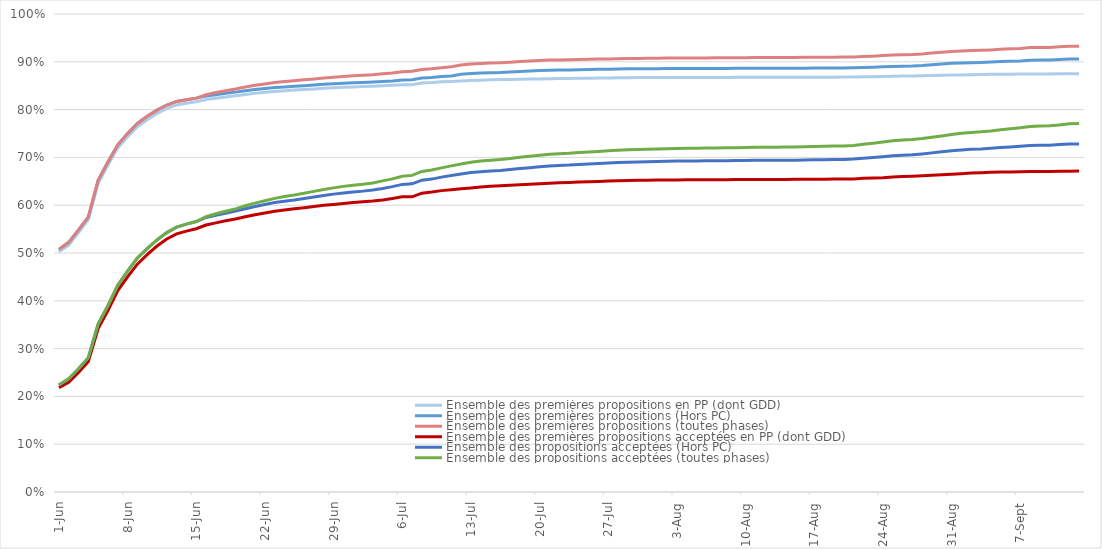
| Category | Ensemble des premières propositions en PP (dont GDD) | Ensemble des premières propositions (Hors PC) | Ensemble des premières propositions (toutes phases) | Ensemble des premières propositions acceptées en PP (dont GDD) | Ensemble des propositions acceptées (Hors PC) | Ensemble des propositions acceptées (toutes phases) |
|---|---|---|---|---|---|---|
| 2023-06-01 | 0.503 | 0.508 | 0.508 | 0.219 | 0.224 | 0.224 |
| 2023-06-02 | 0.516 | 0.522 | 0.522 | 0.229 | 0.237 | 0.237 |
| 2023-06-03 | 0.543 | 0.548 | 0.548 | 0.25 | 0.258 | 0.258 |
| 2023-06-04 | 0.57 | 0.576 | 0.576 | 0.273 | 0.281 | 0.281 |
| 2023-06-05 | 0.646 | 0.652 | 0.652 | 0.342 | 0.351 | 0.351 |
| 2023-06-06 | 0.684 | 0.69 | 0.69 | 0.379 | 0.39 | 0.39 |
| 2023-06-07 | 0.719 | 0.726 | 0.726 | 0.421 | 0.433 | 0.433 |
| 2023-06-08 | 0.743 | 0.75 | 0.75 | 0.45 | 0.462 | 0.462 |
| 2023-06-09 | 0.764 | 0.771 | 0.771 | 0.477 | 0.489 | 0.489 |
| 2023-06-10 | 0.779 | 0.786 | 0.786 | 0.497 | 0.509 | 0.509 |
| 2023-06-11 | 0.792 | 0.799 | 0.799 | 0.515 | 0.527 | 0.527 |
| 2023-06-12 | 0.802 | 0.81 | 0.81 | 0.529 | 0.543 | 0.543 |
| 2023-06-13 | 0.81 | 0.817 | 0.817 | 0.54 | 0.554 | 0.554 |
| 2023-06-14 | 0.813 | 0.821 | 0.821 | 0.546 | 0.56 | 0.56 |
| 2023-06-15 | 0.817 | 0.824 | 0.824 | 0.551 | 0.566 | 0.566 |
| 2023-06-16 | 0.821 | 0.829 | 0.831 | 0.559 | 0.574 | 0.576 |
| 2023-06-17 | 0.824 | 0.831 | 0.836 | 0.563 | 0.579 | 0.582 |
| 2023-06-18 | 0.826 | 0.834 | 0.84 | 0.567 | 0.583 | 0.587 |
| 2023-06-19 | 0.829 | 0.837 | 0.843 | 0.571 | 0.588 | 0.592 |
| 2023-06-20 | 0.832 | 0.839 | 0.847 | 0.576 | 0.593 | 0.599 |
| 2023-06-21 | 0.834 | 0.842 | 0.851 | 0.58 | 0.597 | 0.604 |
| 2023-06-22 | 0.836 | 0.844 | 0.854 | 0.584 | 0.602 | 0.609 |
| 2023-06-23 | 0.838 | 0.846 | 0.857 | 0.587 | 0.605 | 0.614 |
| 2023-06-24 | 0.839 | 0.847 | 0.859 | 0.59 | 0.608 | 0.618 |
| 2023-06-25 | 0.841 | 0.849 | 0.861 | 0.593 | 0.611 | 0.621 |
| 2023-06-26 | 0.842 | 0.85 | 0.862 | 0.595 | 0.614 | 0.625 |
| 2023-06-27 | 0.843 | 0.852 | 0.864 | 0.597 | 0.617 | 0.629 |
| 2023-06-28 | 0.845 | 0.853 | 0.866 | 0.6 | 0.62 | 0.633 |
| 2023-06-29 | 0.846 | 0.854 | 0.868 | 0.602 | 0.623 | 0.636 |
| 2023-06-30 | 0.847 | 0.855 | 0.869 | 0.604 | 0.626 | 0.639 |
| 2023-07-01 | 0.847 | 0.856 | 0.871 | 0.606 | 0.628 | 0.642 |
| 2023-07-02 | 0.848 | 0.857 | 0.872 | 0.607 | 0.629 | 0.644 |
| 2023-07-03 | 0.849 | 0.858 | 0.873 | 0.609 | 0.632 | 0.647 |
| 2023-07-04 | 0.85 | 0.859 | 0.875 | 0.611 | 0.635 | 0.651 |
| 2023-07-05 | 0.851 | 0.86 | 0.876 | 0.614 | 0.639 | 0.655 |
| 2023-07-06 | 0.852 | 0.862 | 0.879 | 0.618 | 0.644 | 0.66 |
| 2023-07-07 | 0.852 | 0.863 | 0.88 | 0.618 | 0.645 | 0.662 |
| 2023-07-08 | 0.856 | 0.866 | 0.884 | 0.625 | 0.652 | 0.671 |
| 2023-07-09 | 0.857 | 0.867 | 0.885 | 0.627 | 0.655 | 0.673 |
| 2023-07-10 | 0.858 | 0.869 | 0.887 | 0.631 | 0.659 | 0.678 |
| 2023-07-11 | 0.859 | 0.871 | 0.889 | 0.632 | 0.662 | 0.682 |
| 2023-07-12 | 0.86 | 0.874 | 0.893 | 0.634 | 0.665 | 0.686 |
| 2023-07-13 | 0.861 | 0.876 | 0.895 | 0.636 | 0.668 | 0.69 |
| 2023-07-14 | 0.862 | 0.876 | 0.897 | 0.638 | 0.67 | 0.692 |
| 2023-07-15 | 0.862 | 0.877 | 0.897 | 0.64 | 0.672 | 0.694 |
| 2023-07-16 | 0.863 | 0.878 | 0.898 | 0.641 | 0.673 | 0.696 |
| 2023-07-17 | 0.863 | 0.879 | 0.899 | 0.642 | 0.675 | 0.698 |
| 2023-07-18 | 0.864 | 0.88 | 0.901 | 0.643 | 0.677 | 0.7 |
| 2023-07-19 | 0.864 | 0.881 | 0.902 | 0.644 | 0.679 | 0.702 |
| 2023-07-20 | 0.864 | 0.882 | 0.903 | 0.645 | 0.68 | 0.705 |
| 2023-07-21 | 0.865 | 0.883 | 0.904 | 0.646 | 0.682 | 0.707 |
| 2023-07-22 | 0.865 | 0.883 | 0.904 | 0.647 | 0.683 | 0.708 |
| 2023-07-23 | 0.865 | 0.883 | 0.904 | 0.648 | 0.684 | 0.709 |
| 2023-07-24 | 0.866 | 0.883 | 0.905 | 0.648 | 0.685 | 0.71 |
| 2023-07-25 | 0.866 | 0.884 | 0.905 | 0.649 | 0.686 | 0.711 |
| 2023-07-26 | 0.866 | 0.884 | 0.906 | 0.65 | 0.687 | 0.713 |
| 2023-07-27 | 0.866 | 0.885 | 0.906 | 0.65 | 0.688 | 0.714 |
| 2023-07-28 | 0.867 | 0.885 | 0.907 | 0.651 | 0.689 | 0.715 |
| 2023-07-29 | 0.867 | 0.885 | 0.907 | 0.652 | 0.69 | 0.716 |
| 2023-07-30 | 0.867 | 0.885 | 0.907 | 0.652 | 0.69 | 0.716 |
| 2023-07-31 | 0.867 | 0.886 | 0.907 | 0.652 | 0.691 | 0.717 |
| 2023-08-01 | 0.867 | 0.886 | 0.908 | 0.653 | 0.692 | 0.718 |
| 2023-08-02 | 0.867 | 0.886 | 0.908 | 0.653 | 0.692 | 0.718 |
| 2023-08-03 | 0.867 | 0.886 | 0.908 | 0.653 | 0.692 | 0.719 |
| 2023-08-04 | 0.867 | 0.886 | 0.908 | 0.653 | 0.693 | 0.719 |
| 2023-08-05 | 0.867 | 0.886 | 0.908 | 0.653 | 0.693 | 0.719 |
| 2023-08-06 | 0.867 | 0.886 | 0.908 | 0.653 | 0.693 | 0.719 |
| 2023-08-07 | 0.867 | 0.886 | 0.908 | 0.653 | 0.693 | 0.72 |
| 2023-08-08 | 0.867 | 0.886 | 0.908 | 0.653 | 0.693 | 0.72 |
| 2023-08-09 | 0.867 | 0.886 | 0.909 | 0.654 | 0.693 | 0.72 |
| 2023-08-10 | 0.867 | 0.886 | 0.909 | 0.654 | 0.694 | 0.721 |
| 2023-08-11 | 0.868 | 0.886 | 0.909 | 0.654 | 0.694 | 0.721 |
| 2023-08-12 | 0.868 | 0.887 | 0.909 | 0.654 | 0.694 | 0.721 |
| 2023-08-13 | 0.868 | 0.887 | 0.909 | 0.654 | 0.694 | 0.721 |
| 2023-08-14 | 0.868 | 0.887 | 0.909 | 0.654 | 0.694 | 0.722 |
| 2023-08-15 | 0.868 | 0.887 | 0.909 | 0.654 | 0.694 | 0.722 |
| 2023-08-16 | 0.868 | 0.887 | 0.909 | 0.654 | 0.695 | 0.722 |
| 2023-08-17 | 0.868 | 0.887 | 0.909 | 0.654 | 0.695 | 0.723 |
| 2023-08-18 | 0.868 | 0.887 | 0.91 | 0.654 | 0.695 | 0.723 |
| 2023-08-19 | 0.868 | 0.887 | 0.91 | 0.655 | 0.695 | 0.724 |
| 2023-08-20 | 0.868 | 0.887 | 0.91 | 0.655 | 0.696 | 0.724 |
| 2023-08-21 | 0.868 | 0.887 | 0.91 | 0.655 | 0.696 | 0.725 |
| 2023-08-22 | 0.869 | 0.888 | 0.911 | 0.656 | 0.698 | 0.727 |
| 2023-08-23 | 0.869 | 0.888 | 0.912 | 0.657 | 0.7 | 0.73 |
| 2023-08-24 | 0.869 | 0.889 | 0.913 | 0.658 | 0.701 | 0.732 |
| 2023-08-25 | 0.87 | 0.89 | 0.914 | 0.659 | 0.703 | 0.735 |
| 2023-08-26 | 0.87 | 0.891 | 0.915 | 0.66 | 0.704 | 0.736 |
| 2023-08-27 | 0.87 | 0.891 | 0.915 | 0.661 | 0.705 | 0.737 |
| 2023-08-28 | 0.871 | 0.892 | 0.916 | 0.662 | 0.707 | 0.739 |
| 2023-08-29 | 0.871 | 0.894 | 0.918 | 0.663 | 0.709 | 0.742 |
| 2023-08-30 | 0.872 | 0.896 | 0.92 | 0.664 | 0.712 | 0.745 |
| 2023-08-31 | 0.872 | 0.897 | 0.922 | 0.665 | 0.714 | 0.748 |
| 2023-09-01 | 0.873 | 0.898 | 0.923 | 0.666 | 0.716 | 0.751 |
| 2023-09-02 | 0.873 | 0.898 | 0.923 | 0.667 | 0.717 | 0.752 |
| 2023-09-03 | 0.874 | 0.899 | 0.924 | 0.668 | 0.718 | 0.753 |
| 2023-09-04 | 0.874 | 0.899 | 0.925 | 0.669 | 0.719 | 0.755 |
| 2023-09-05 | 0.874 | 0.9 | 0.926 | 0.669 | 0.721 | 0.758 |
| 2023-09-06 | 0.874 | 0.901 | 0.927 | 0.67 | 0.722 | 0.76 |
| 2023-09-07 | 0.874 | 0.902 | 0.928 | 0.67 | 0.723 | 0.762 |
| 2023-09-08 | 0.874 | 0.903 | 0.93 | 0.67 | 0.725 | 0.765 |
| 2023-09-09 | 0.874 | 0.904 | 0.93 | 0.67 | 0.725 | 0.766 |
| 2023-09-10 | 0.875 | 0.904 | 0.93 | 0.671 | 0.725 | 0.766 |
| 2023-09-11 | 0.875 | 0.905 | 0.931 | 0.671 | 0.727 | 0.768 |
| 2023-09-12 | 0.875 | 0.906 | 0.932 | 0.671 | 0.728 | 0.77 |
| 2023-09-13 | 0.875 | 0.906 | 0.933 | 0.671 | 0.728 | 0.771 |